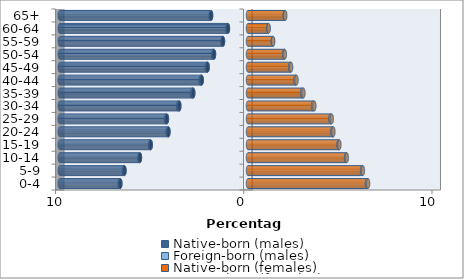
| Category | Native-born (males) | Foreign-born (males) | Native-born (females) | Foreign-born (females) |
|---|---|---|---|---|
| 0-4 | -6.783 | -0.041 | 6.318 | 0.061 |
| 5-9 | -6.563 | -0.033 | 6.059 | 0.046 |
| 10-14 | -5.74 | -0.031 | 5.209 | 0.039 |
| 15-19 | -5.168 | -0.036 | 4.816 | 0.04 |
| 20-24 | -4.226 | -0.044 | 4.486 | 0.05 |
| 25-29 | -4.307 | -0.057 | 4.387 | 0.061 |
| 30-34 | -3.65 | -0.066 | 3.455 | 0.07 |
| 35-39 | -2.91 | -0.067 | 2.879 | 0.066 |
| 40-44 | -2.46 | -0.062 | 2.521 | 0.055 |
| 45-49 | -2.145 | -0.051 | 2.247 | 0.043 |
| 50-54 | -1.807 | -0.041 | 1.924 | 0.029 |
| 55-59 | -1.329 | -0.033 | 1.317 | 0.02 |
| 60-64 | -1.066 | -0.03 | 1.083 | 0.011 |
| 65+ | -1.962 | -0.023 | 1.954 | 0.025 |